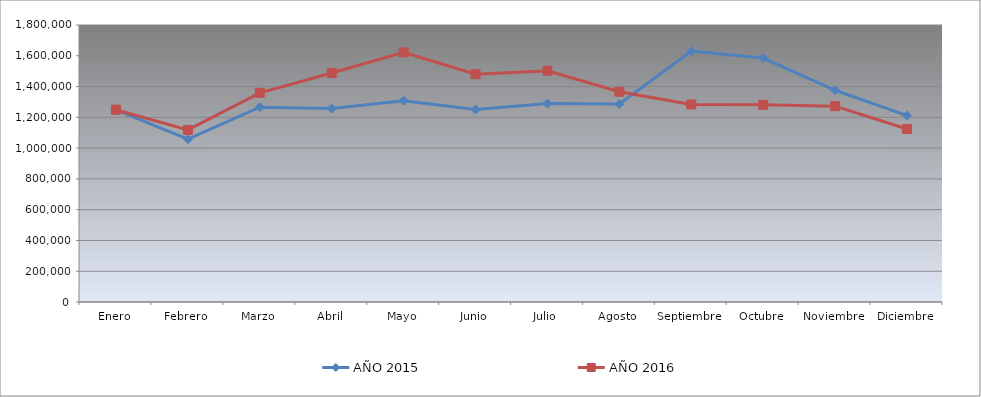
| Category | AÑO 2015 | AÑO 2016 |
|---|---|---|
| Enero | 1249111.579 | 1249660 |
| Febrero | 1057754.649 | 1118420 |
| Marzo | 1266201.843 | 1359040 |
| Abril | 1256776.268 | 1488420 |
| Mayo | 1308321.151 | 1621860 |
| Junio | 1250821.197 | 1480370 |
| Julio | 1289450.282 | 1503020 |
| Agosto | 1286295.277 | 1366700 |
| Septiembre | 1630447.096 | 1283560 |
| Octubre | 1585330.534 | 1281360 |
| Noviembre | 1375788.948 | 1272560 |
| Diciembre | 1211620.268 | 1124160 |